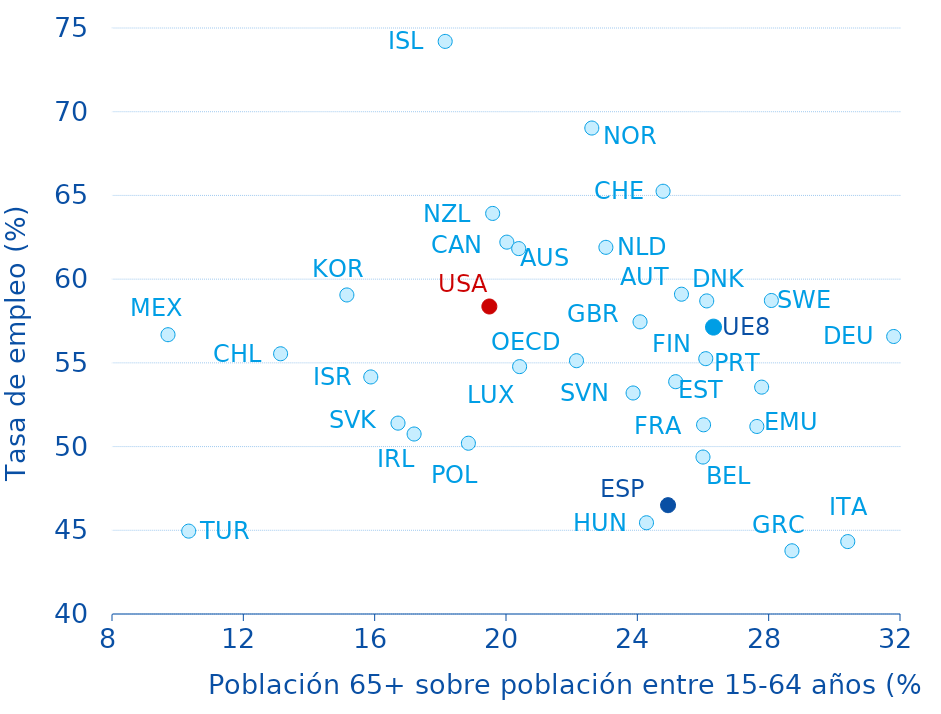
| Category | Series 0 |
|---|---|
| 20.0255 | 62.209 |
| 26.11359 | 58.7 |
| 25.99961 | 49.375 |
| 20.38628 | 61.825 |
| 13.13504 | 55.542 |
| #N/A | 54.35 |
| 25.34467 | 59.1 |
| 25.16809 | 53.875 |
| 26.08451 | 55.25 |
| 26.01745 | 51.3 |
| 31.80773 | 56.575 |
| 28.70869 | 43.775 |
| 24.27906 | 45.45 |
| 18.14807 | 74.2 |
| 16.711 | 51.4 |
| 15.88156 | 54.158 |
| 30.40894 | 44.325 |
| 36.07267 | 56.62 |
| 15.15317 | 59.056 |
| 20.41411 | 54.775 |
| 9.705804 | 56.681 |
| 23.04239 | 61.9 |
| 19.59366 | 63.925 |
| 22.61353 | 69.025 |
| 18.85467 | 50.2 |
| 27.78649 | 53.55 |
| 17.20133 | 50.75 |
| 23.87079 | 53.2 |
| 24.93506 | 46.5 |
| 28.08253 | 58.725 |
| 24.784 | 65.25 |
| 10.33624 | 44.95 |
| 24.08245 | 57.45 |
| 19.49328 | 58.367 |
| 27.63954 | 51.2 |
| 26.319685 | 57.134 |
| 22.14706 | 55.13 |